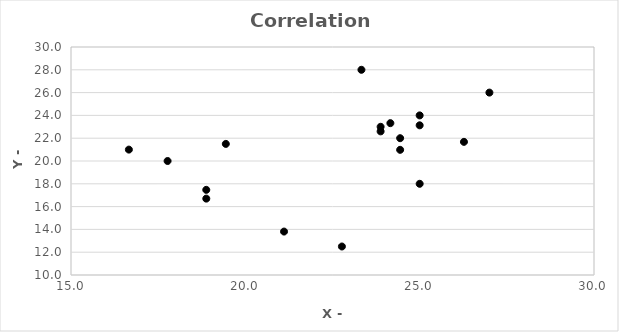
| Category | Series 0 |
|---|---|
| 18.88 | 17.47 |
| 17.77 | 20 |
| 18.88 | 16.7 |
| 21.11 | 13.81 |
| 22.77 | 12.5 |
| 26.27 | 21.68 |
| 24.44 | 20.98 |
| 24.44 | 22 |
| 23.88 | 23 |
| 25.0 | 18 |
| 27.0 | 26 |
| 25.0 | 23.13 |
| 25.0 | 24 |
| 24.16 | 23.32 |
| 23.88 | 22.6 |
| 23.33 | 28 |
| 19.44 | 21.5 |
| 16.66 | 21 |